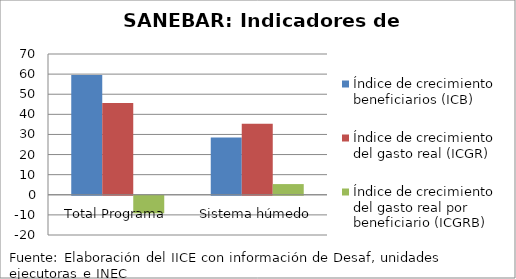
| Category | Índice de crecimiento beneficiarios (ICB)  | Índice de crecimiento del gasto real (ICGR)  | Índice de crecimiento del gasto real por beneficiario (ICGRB)  |
|---|---|---|---|
| Total Programa | 59.619 | 45.681 | -8.732 |
| Sistema húmedo | 28.476 | 35.307 | 5.316 |